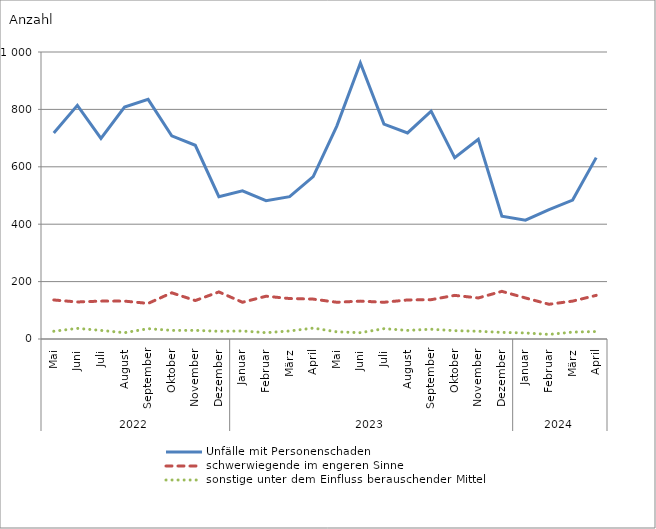
| Category | Unfälle mit Personenschaden | schwerwiegende im engeren Sinne | sonstige unter dem Einfluss berauschender Mittel |
|---|---|---|---|
| 0 | 718 | 136 | 27 |
| 1 | 814 | 129 | 37 |
| 2 | 699 | 132 | 30 |
| 3 | 808 | 132 | 22 |
| 4 | 835 | 124 | 36 |
| 5 | 708 | 161 | 30 |
| 6 | 675 | 134 | 30 |
| 7 | 496 | 164 | 27 |
| 8 | 516 | 128 | 28 |
| 9 | 482 | 149 | 22 |
| 10 | 496 | 141 | 28 |
| 11 | 566 | 139 | 38 |
| 12 | 742 | 128 | 25 |
| 13 | 962 | 132 | 22 |
| 14 | 749 | 128 | 36 |
| 15 | 718 | 136 | 30 |
| 16 | 794 | 137 | 34 |
| 17 | 632 | 152 | 29 |
| 18 | 696 | 143 | 27 |
| 19 | 428 | 166 | 23 |
| 20 | 414 | 143 | 21 |
| 21 | 451 | 121 | 16 |
| 22 | 484 | 132 | 24 |
| 23 | 632 | 152 | 26 |